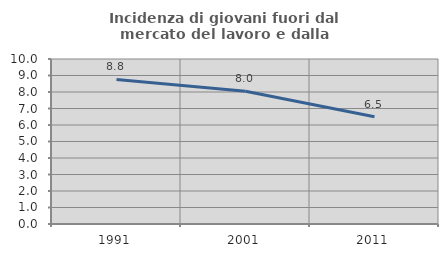
| Category | Incidenza di giovani fuori dal mercato del lavoro e dalla formazione  |
|---|---|
| 1991.0 | 8.759 |
| 2001.0 | 8.047 |
| 2011.0 | 6.499 |